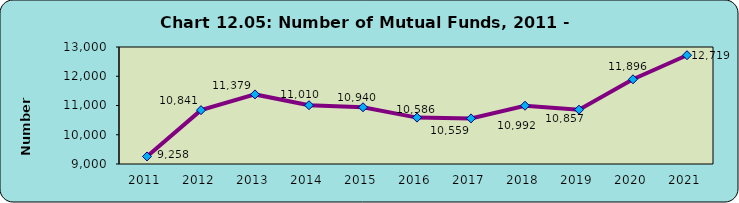
| Category | Mutual Funds |
|---|---|
| 2011.0 | 9258 |
| 2012.0 | 10841 |
| 2013.0 | 11379 |
| 2014.0 | 11010 |
| 2015.0 | 10940 |
| 2016.0 | 10586 |
| 2017.0 | 10559 |
| 2018.0 | 10992 |
| 2019.0 | 10857 |
| 2020.0 | 11896 |
| 2021.0 | 12719 |